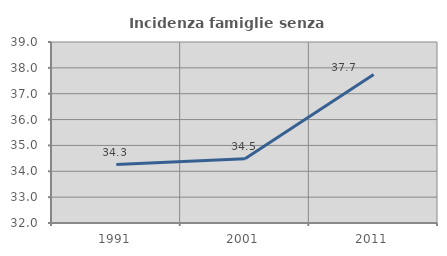
| Category | Incidenza famiglie senza nuclei |
|---|---|
| 1991.0 | 34.259 |
| 2001.0 | 34.483 |
| 2011.0 | 37.741 |